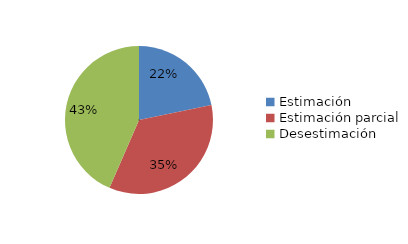
| Category | Series 0 |
|---|---|
| Estimación | 5 |
| Estimación parcial | 8 |
| Desestimación | 10 |